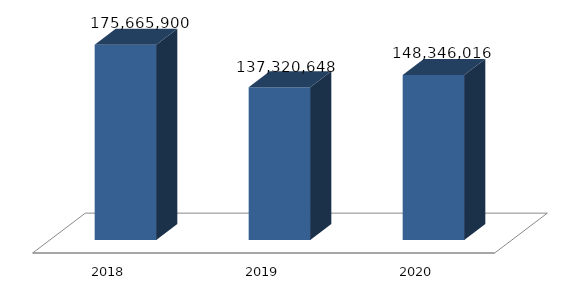
| Category | Dukungan Manajemen dan Pelaksanaan Tugas Teknis Lainnya Lemhannas |
|---|---|
| 2018.0 | 175665900 |
| 2019.0 | 137320648 |
| 2020.0 | 148346016 |